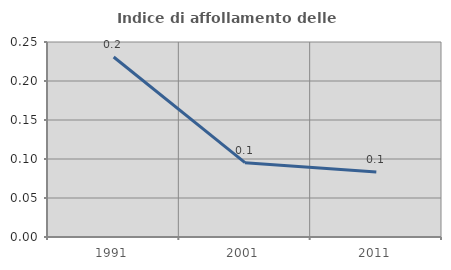
| Category | Indice di affollamento delle abitazioni  |
|---|---|
| 1991.0 | 0.231 |
| 2001.0 | 0.095 |
| 2011.0 | 0.083 |